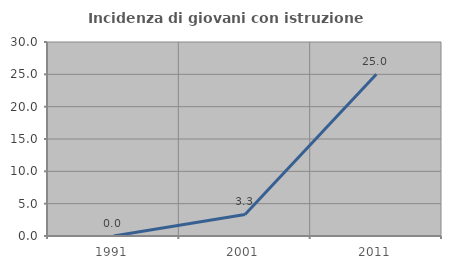
| Category | Incidenza di giovani con istruzione universitaria |
|---|---|
| 1991.0 | 0 |
| 2001.0 | 3.333 |
| 2011.0 | 25 |